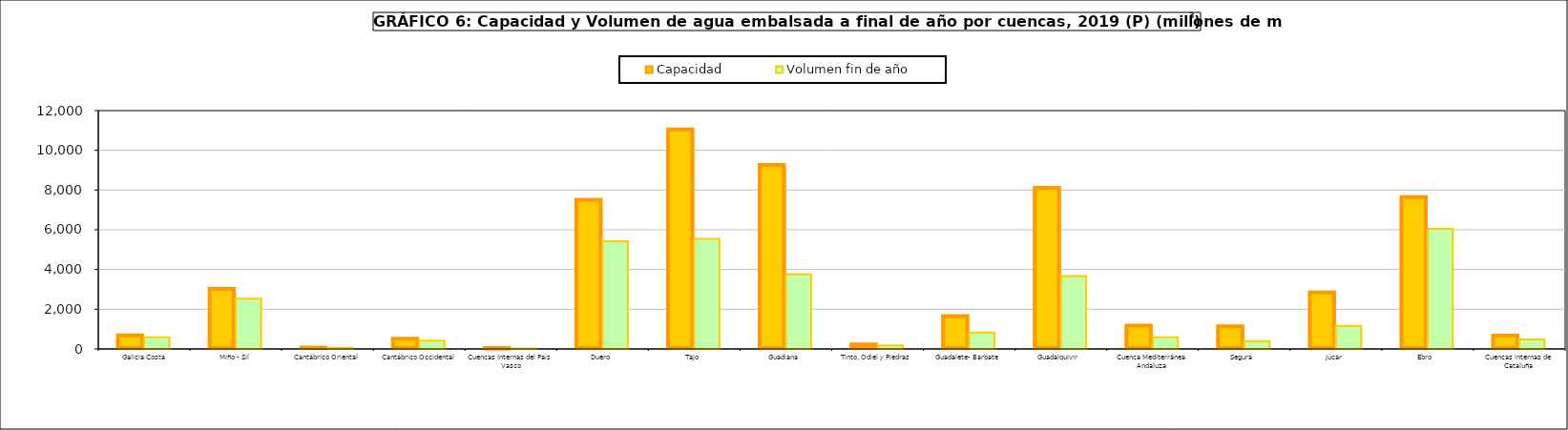
| Category | Capacidad | Volumen fin de año |
|---|---|---|
| Galicia Costa | 684 | 584 |
| Miño - Sil | 3030 | 2532 |
| Cantábrico Oriental | 73 | 64 |
| Cantábrico Occidental | 518 | 417 |
| Cuencas Internas del País Vasco | 21 | 19 |
| Duero  | 7507 | 5424 |
| Tajo  | 11056 | 5539 |
| Guadiana  | 9261 | 3753 |
| Tinto, Odiel y Piedras | 229 | 176 |
| Guadalete- Barbate | 1651 | 824 |
| Guadalquivir  | 8113 | 3672 |
| Cuenca Mediterránea Andaluza | 1174 | 585 |
| Segura  | 1140 | 400 |
| Júcar  | 2846 | 1161 |
| Ebro  | 7642 | 6052 |
| Cuencas internas de Cataluña | 677 | 476 |